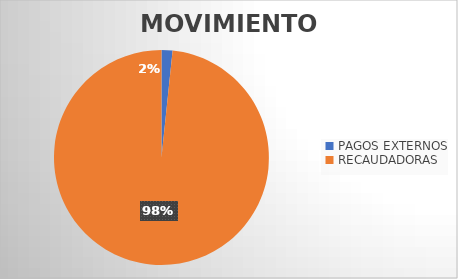
| Category | MOVIMIENTOS |
|---|---|
| PAGOS EXTERNOS | 397 |
| RECAUDADORAS | 23635 |